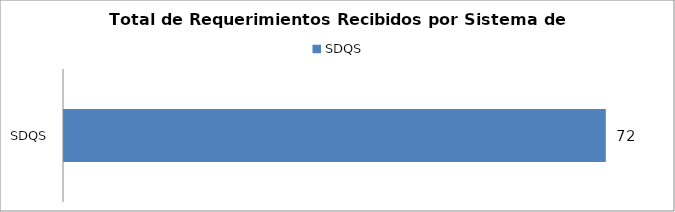
| Category | Total |
|---|---|
| SDQS | 72 |